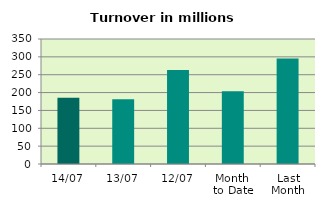
| Category | Series 0 |
|---|---|
| 14/07 | 185.151 |
| 13/07 | 181.369 |
| 12/07 | 263.437 |
| Month 
to Date | 204.031 |
| Last
Month | 295.453 |